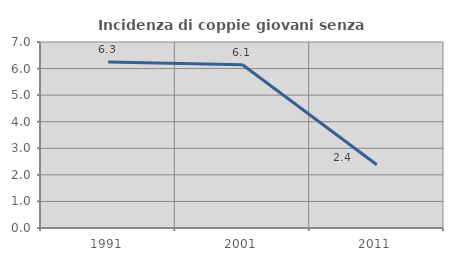
| Category | Incidenza di coppie giovani senza figli |
|---|---|
| 1991.0 | 6.25 |
| 2001.0 | 6.145 |
| 2011.0 | 2.381 |